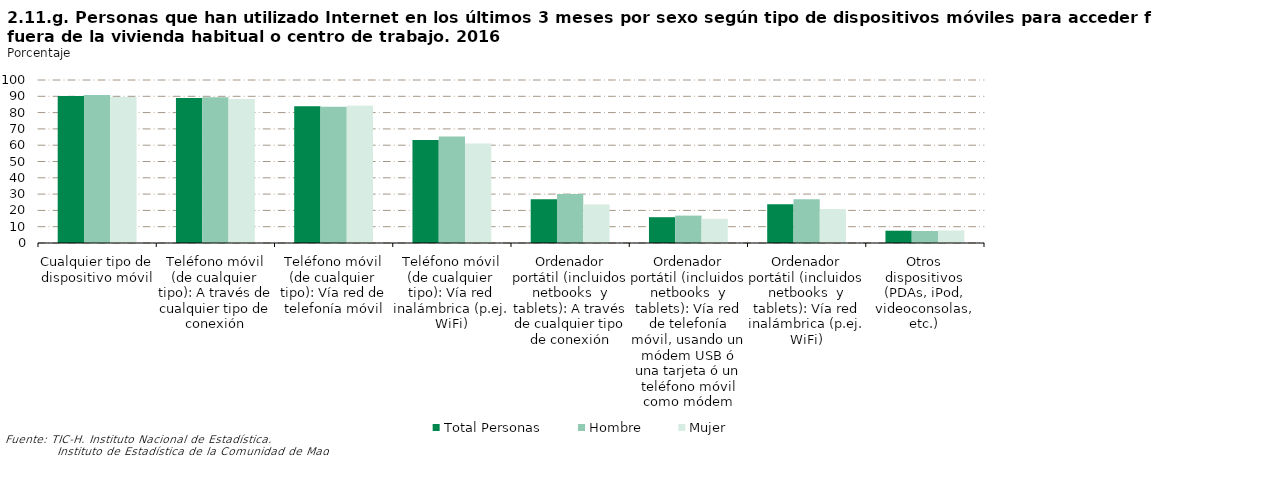
| Category | Total Personas | Hombre | Mujer |
|---|---|---|---|
| Cualquier tipo de dispositivo móvil | 90.178 | 90.742 | 89.611 |
| Teléfono móvil (de cualquier tipo): A través de cualquier tipo de conexión | 88.89 | 89.372 | 88.407 |
| Teléfono móvil (de cualquier tipo): Vía red de telefonía móvil | 83.936 | 83.661 | 84.211 |
| Teléfono móvil (de cualquier tipo): Vía red inalámbrica (p.ej. WiFi) | 63.237 | 65.363 | 61.104 |
| Ordenador portátil (incluidos netbooks  y tablets): A través de cualquier tipo de conexión | 26.87 | 30.08 | 23.648 |
| Ordenador portátil (incluidos netbooks  y tablets): Vía red de telefonía móvil, usando un módem USB ó una tarjeta ó un teléfono móvil como módem | 15.83 | 16.815 | 14.841 |
| Ordenador portátil (incluidos netbooks  y tablets): Vía red inalámbrica (p.ej. WiFi) | 23.808 | 26.79 | 20.816 |
| Otros dispositivos (PDAs, iPod, videoconsolas, etc.) | 7.546 | 7.391 | 7.701 |